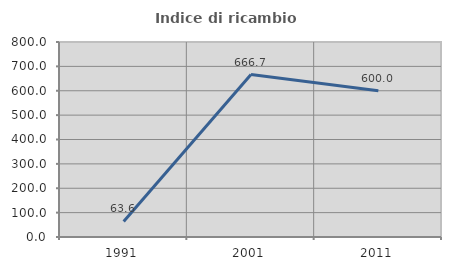
| Category | Indice di ricambio occupazionale  |
|---|---|
| 1991.0 | 63.636 |
| 2001.0 | 666.667 |
| 2011.0 | 600 |